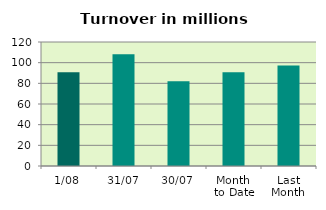
| Category | Series 0 |
|---|---|
| 1/08 | 90.764 |
| 31/07 | 108.174 |
| 30/07 | 82.055 |
| Month 
to Date | 90.764 |
| Last
Month | 97.283 |